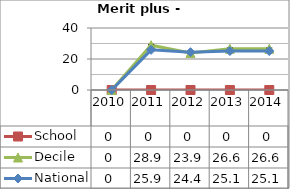
| Category | School  | Decile | National |
|---|---|---|---|
| 2010.0 | 0 | 0 | 0 |
| 2011.0 | 0 | 28.9 | 25.9 |
| 2012.0 | 0 | 23.9 | 24.4 |
| 2013.0 | 0 | 26.6 | 25.1 |
| 2014.0 | 0 | 26.6 | 25.1 |